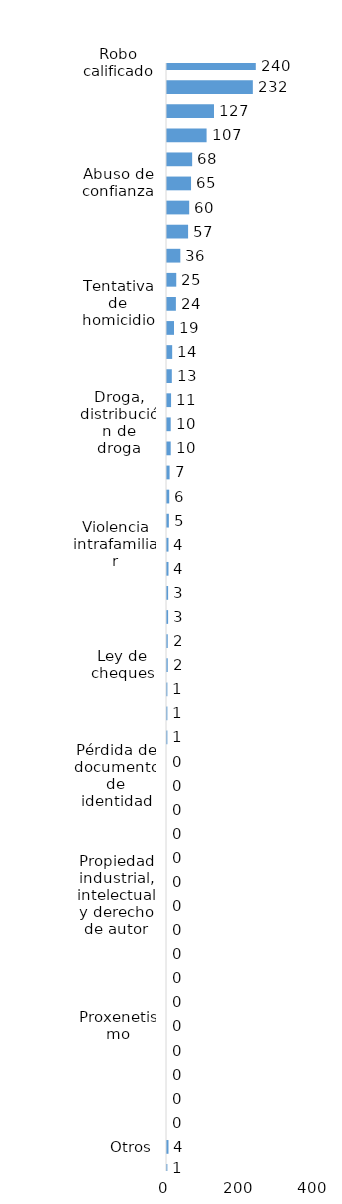
| Category | Series 0 |
|---|---|
| Robo calificado | 240 |
| Amenaza | 232 |
| Crímenes y delitos de alta tecnología | 127 |
| Golpes y heridas | 107 |
| Daños y perjuicios a la cosa ajena | 68 |
| Abuso de confianza | 65 |
| Código de trabajo | 60 |
| Código del menor NNA | 57 |
| Estafa | 36 |
| Asociación de malhechores | 25 |
| Tentativa de homicidio | 24 |
| Protección animal y tenencia responsable | 19 |
| Droga, simple posesión | 14 |
| Ley de armas | 13 |
| Falsificación | 11 |
| Droga, distribución de droga | 10 |
| Homicidio | 10 |
| Robo simple | 7 |
| Tránsito y seguridad vial  | 6 |
| Droga, traficante de droga | 5 |
| Violencia intrafamiliar | 4 |
| Crímenes y delitos contra la propiedad | 4 |
| Violencia de género | 3 |
| Medio ambiente y recursos naturales | 3 |
| Tráfico ilícito de migrantes y trata de personas | 2 |
| Ley de cheques | 2 |
| Ley general de salud | 1 |
| Derechos humanos | 1 |
| Terrorismo | 1 |
| Agresión sexual | 0 |
| Pérdida de documento de identidad | 0 |
| Violación sexual | 0 |
| Desaparición | 0 |
| Droga, sanciones y circunstancias agravantes | 0 |
| Difamación e injuria | 0 |
| Propiedad industrial, intelectual y derecho de autor | 0 |
| Conflictos sociales | 0 |
| Secuestro | 0 |
| Contra el lavado de activos  | 0 |
| Juegos de azar | 0 |
| Proxenetismo | 0 |
| Soborno | 0 |
| Prevaricación | 0 |
| Droga, delitos y sanciones | 0 |
| Aborto y tentativa | 0 |
| Otros | 4 |
| Indeterminados | 1 |